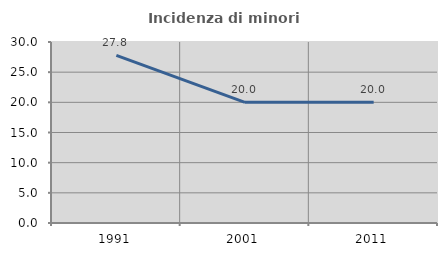
| Category | Incidenza di minori stranieri |
|---|---|
| 1991.0 | 27.778 |
| 2001.0 | 20 |
| 2011.0 | 20 |